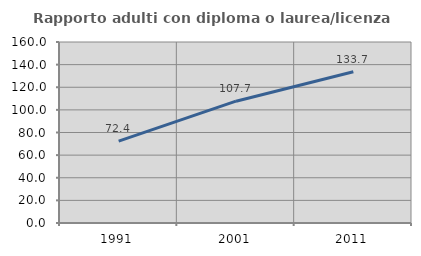
| Category | Rapporto adulti con diploma o laurea/licenza media  |
|---|---|
| 1991.0 | 72.437 |
| 2001.0 | 107.68 |
| 2011.0 | 133.703 |